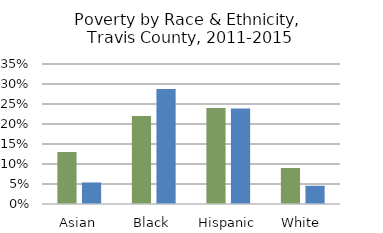
| Category | % poverty | % child poverty |
|---|---|---|
| Asian | 0.13 | 0.054 |
| Black | 0.22 | 0.288 |
| Hispanic | 0.24 | 0.239 |
| White | 0.09 | 0.046 |